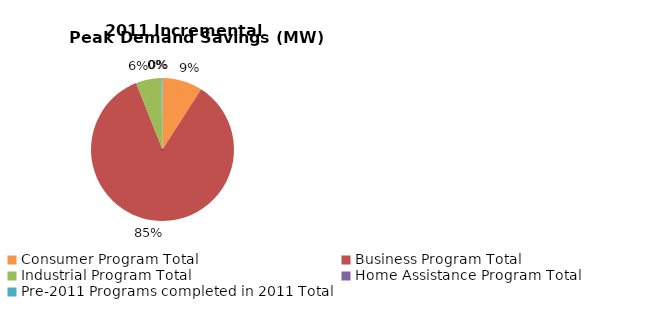
| Category | Incremental Peak Demand Savings (kW) |
|---|---|
| Consumer Program Total | 13.551 |
| Business Program Total | 126.967 |
| Industrial Program Total | 8.55 |
| Home Assistance Program Total | 0 |
| Pre-2011 Programs completed in 2011 Total | 0.425 |